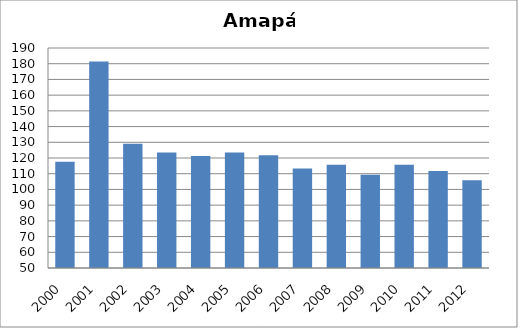
| Category | BCG |
|---|---|
| 2000.0 | 117.68 |
| 2001.0 | 181.41 |
| 2002.0 | 129.05 |
| 2003.0 | 123.55 |
| 2004.0 | 121.2 |
| 2005.0 | 123.56 |
| 2006.0 | 121.68 |
| 2007.0 | 113.26 |
| 2008.0 | 115.66 |
| 2009.0 | 109.4 |
| 2010.0 | 115.69 |
| 2011.0 | 111.74 |
| 2012.0 | 105.8 |